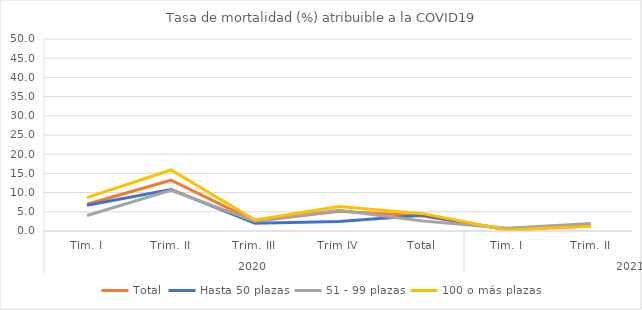
| Category | Total | Hasta 50 plazas | 51 - 99 plazas | 100 o más plazas |
|---|---|---|---|---|
| 0 | 6.979 | 6.7 | 4.04 | 8.702 |
| 1 | 13.228 | 10.804 | 10.57 | 15.889 |
| 2 | 2.57 | 2.019 | 2.57 | 2.854 |
| 3 | 5.144 | 2.484 | 5.425 | 6.355 |
| 4 | 3.914 | 4.103 | 2.606 | 4.518 |
| 5 | 0.385 | 0.312 | 0.685 | 0.262 |
| 6 | 1.463 | 1.445 | 1.939 | 1.214 |